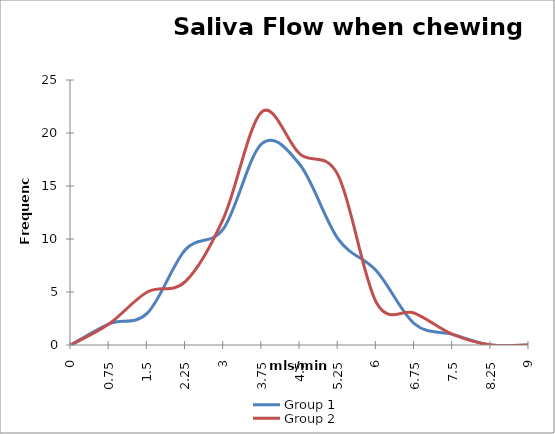
| Category | Group 1 | Group 2 |
|---|---|---|
| 0.0 | 0 | 0 |
| 0.75 | 2 | 2 |
| 1.5 | 3 | 5 |
| 2.25 | 9 | 6 |
| 3.0 | 11 | 12 |
| 3.75 | 19 | 22 |
| 4.5 | 17 | 18 |
| 5.25 | 10 | 16 |
| 6.0 | 7 | 4 |
| 6.75 | 2 | 3 |
| 7.5 | 1 | 1 |
| 8.25 | 0 | 0 |
| 9.0 | 0 | 0 |